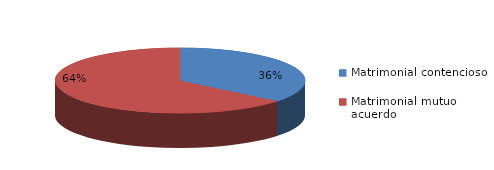
| Category | Series 0 |
|---|---|
| 0 | 457 |
| 1 | 816 |